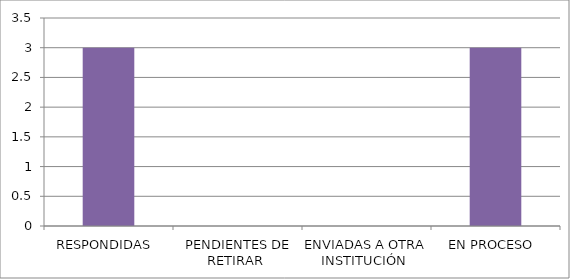
| Category | Series 0 |
|---|---|
| RESPONDIDAS  | 3 |
| PENDIENTES DE RETIRAR  | 0 |
| ENVIADAS A OTRA INSTITUCIÓN  | 0 |
| EN PROCESO  | 3 |